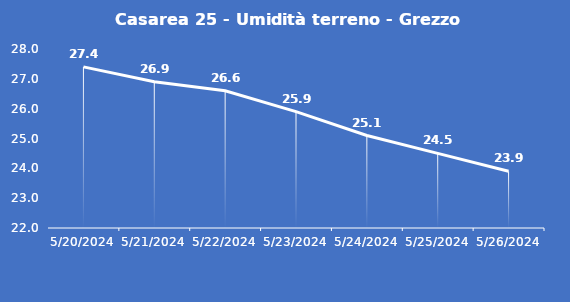
| Category | Casarea 25 - Umidità terreno - Grezzo (%VWC) |
|---|---|
| 5/20/24 | 27.4 |
| 5/21/24 | 26.9 |
| 5/22/24 | 26.6 |
| 5/23/24 | 25.9 |
| 5/24/24 | 25.1 |
| 5/25/24 | 24.5 |
| 5/26/24 | 23.9 |